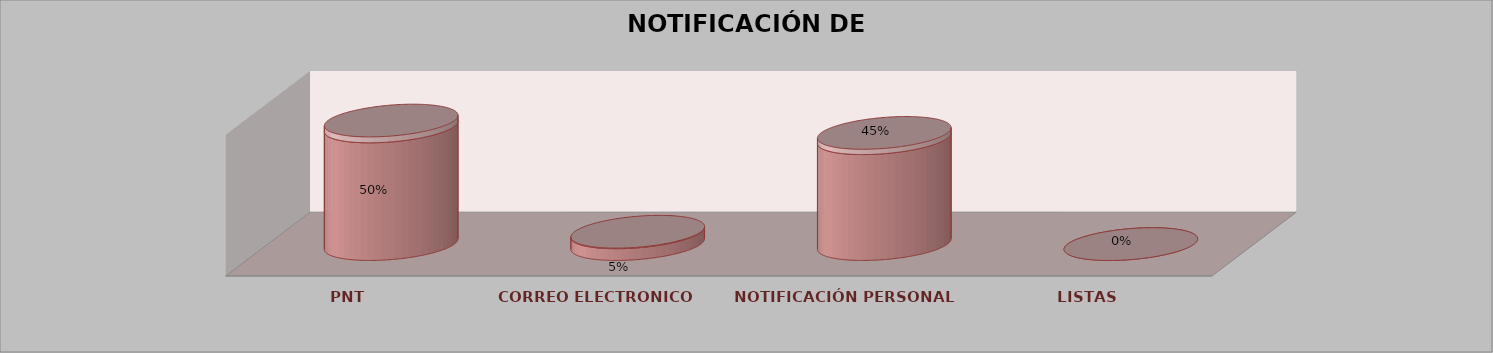
| Category | Series 0 | Series 1 | Series 2 | Series 3 | Series 4 |
|---|---|---|---|---|---|
| PNT |  |  |  | 10 | 0.5 |
| CORREO ELECTRONICO |  |  |  | 1 | 0.05 |
| NOTIFICACIÓN PERSONAL |  |  |  | 9 | 0.45 |
| LISTAS |  |  |  | 0 | 0 |